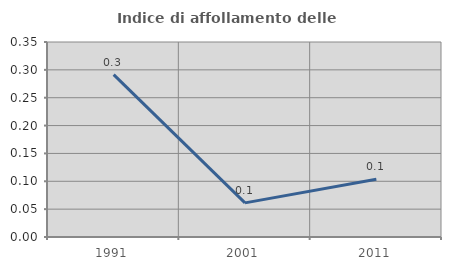
| Category | Indice di affollamento delle abitazioni  |
|---|---|
| 1991.0 | 0.291 |
| 2001.0 | 0.061 |
| 2011.0 | 0.104 |